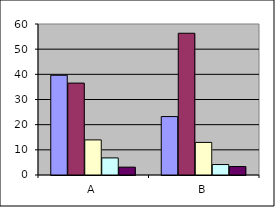
| Category | Series 0 | Series 1 | Series 2 | Series 3 | Series 4 |
|---|---|---|---|---|---|
| A | 39.633 | 36.514 | 13.945 | 6.789 | 3.119 |
| B | 23.213 | 56.323 | 12.951 | 4.154 | 3.36 |